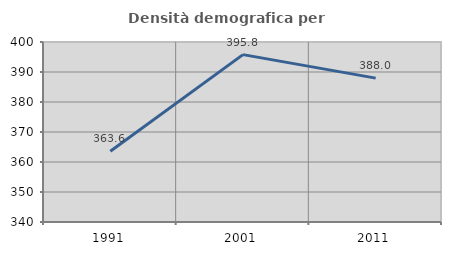
| Category | Densità demografica |
|---|---|
| 1991.0 | 363.605 |
| 2001.0 | 395.79 |
| 2011.0 | 387.961 |